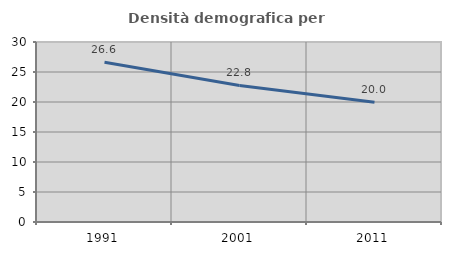
| Category | Densità demografica |
|---|---|
| 1991.0 | 26.629 |
| 2001.0 | 22.758 |
| 2011.0 | 19.955 |